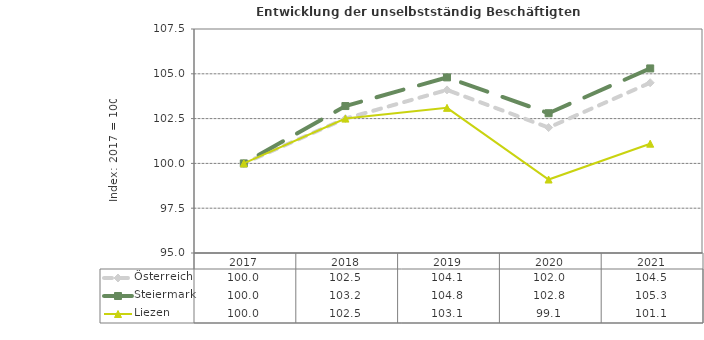
| Category | Österreich | Steiermark | Liezen |
|---|---|---|---|
| 2021.0 | 104.5 | 105.3 | 101.1 |
| 2020.0 | 102 | 102.8 | 99.1 |
| 2019.0 | 104.1 | 104.8 | 103.1 |
| 2018.0 | 102.5 | 103.2 | 102.5 |
| 2017.0 | 100 | 100 | 100 |